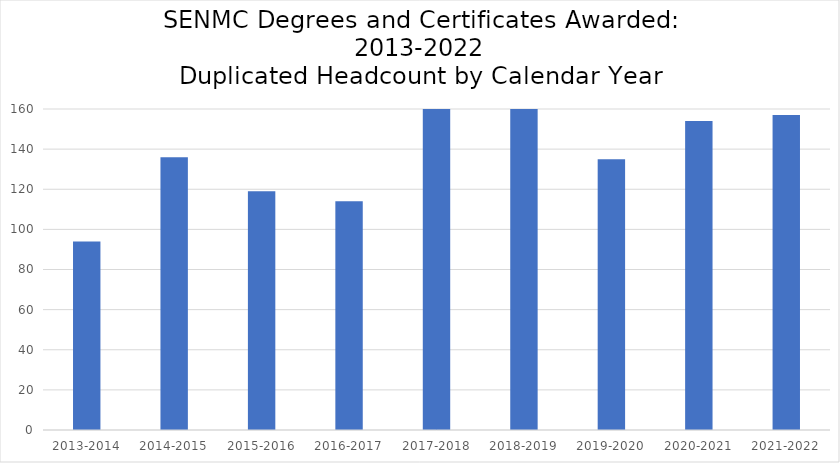
| Category | Series 0 |
|---|---|
| 2013-2014 | 94 |
| 2014-2015 | 136 |
| 2015-2016 | 119 |
| 2016-2017 | 114 |
| 2017-2018 | 181 |
| 2018-2019 | 184 |
| 2019-2020 | 135 |
| 2020-2021 | 154 |
| 2021-2022 | 157 |